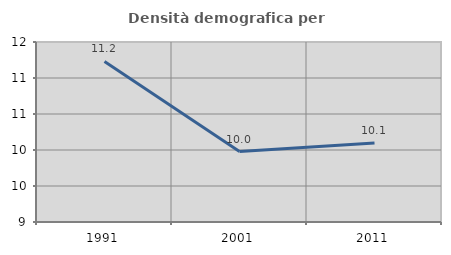
| Category | Densità demografica |
|---|---|
| 1991.0 | 11.231 |
| 2001.0 | 9.978 |
| 2011.0 | 10.098 |